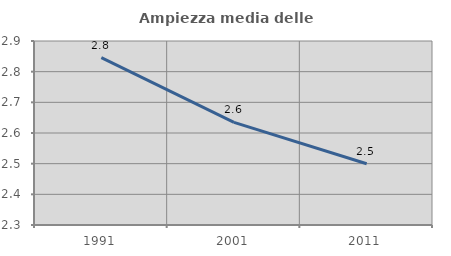
| Category | Ampiezza media delle famiglie |
|---|---|
| 1991.0 | 2.846 |
| 2001.0 | 2.634 |
| 2011.0 | 2.5 |